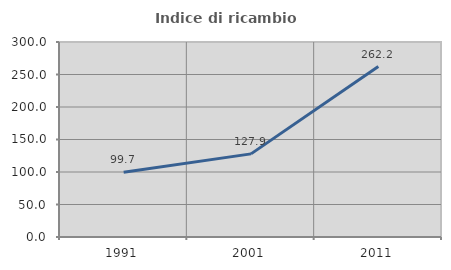
| Category | Indice di ricambio occupazionale  |
|---|---|
| 1991.0 | 99.708 |
| 2001.0 | 127.902 |
| 2011.0 | 262.199 |